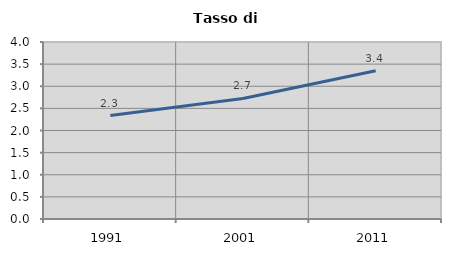
| Category | Tasso di disoccupazione   |
|---|---|
| 1991.0 | 2.337 |
| 2001.0 | 2.724 |
| 2011.0 | 3.351 |